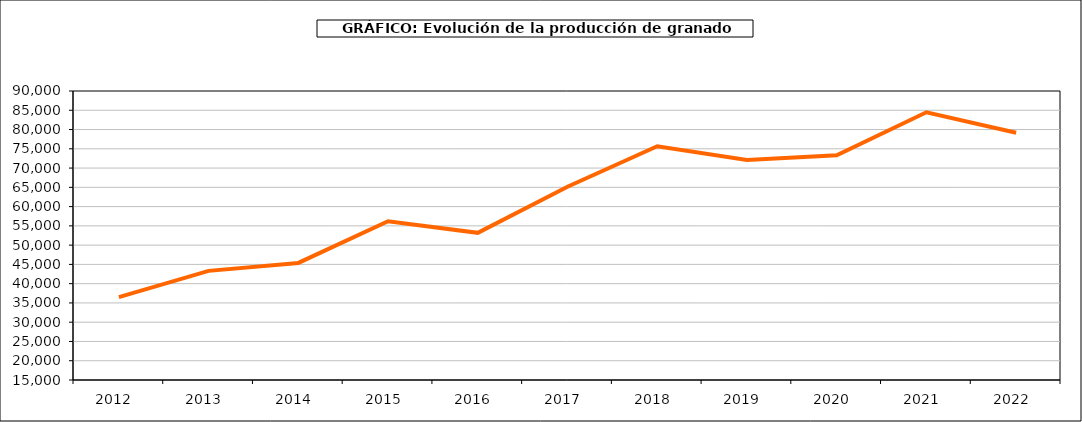
| Category | producción granado |
|---|---|
| 2012.0 | 36495 |
| 2013.0 | 43324 |
| 2014.0 | 45382 |
| 2015.0 | 56185 |
| 2016.0 | 53187 |
| 2017.0 | 65165 |
| 2018.0 | 75673 |
| 2019.0 | 72115 |
| 2020.0 | 73341 |
| 2021.0 | 84477 |
| 2022.0 | 79183 |